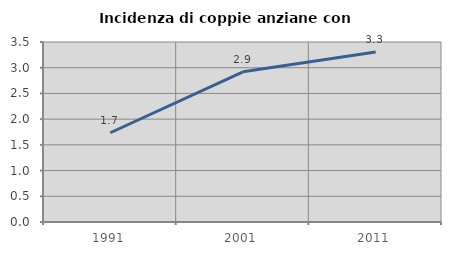
| Category | Incidenza di coppie anziane con figli |
|---|---|
| 1991.0 | 1.735 |
| 2001.0 | 2.92 |
| 2011.0 | 3.307 |